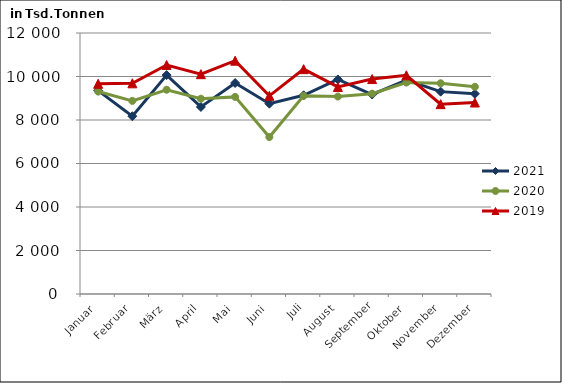
| Category | 2021 | 2020 | 2019 |
|---|---|---|---|
| Januar | 9349.531 | 9310.02 | 9664.692 |
| Februar | 8173.379 | 8877.974 | 9686.28 |
| März | 10065.082 | 9391.369 | 10529.694 |
| April | 8600.521 | 8978.437 | 10107.696 |
| Mai | 9700.58 | 9062.412 | 10725.608 |
| Juni | 8750.88 | 7215.592 | 9110.591 |
| Juli | 9134.854 | 9111.226 | 10338.964 |
| August | 9864.506 | 9078.504 | 9520.82 |
| September | 9172.31 | 9211.016 | 9882.006 |
| Oktober | 9837.214 | 9721.742 | 10053.625 |
| November | 9304.301 | 9688.777 | 8728.663 |
| Dezember | 9202.63 | 9527.256 | 8803.67 |